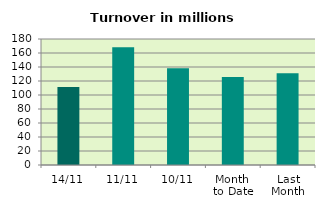
| Category | Series 0 |
|---|---|
| 14/11 | 111.443 |
| 11/11 | 168.176 |
| 10/11 | 138.333 |
| Month 
to Date | 125.787 |
| Last
Month | 131.017 |